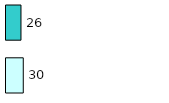
| Category | Series 0 | Series 1 |
|---|---|---|
| 0 | 30 | 26 |